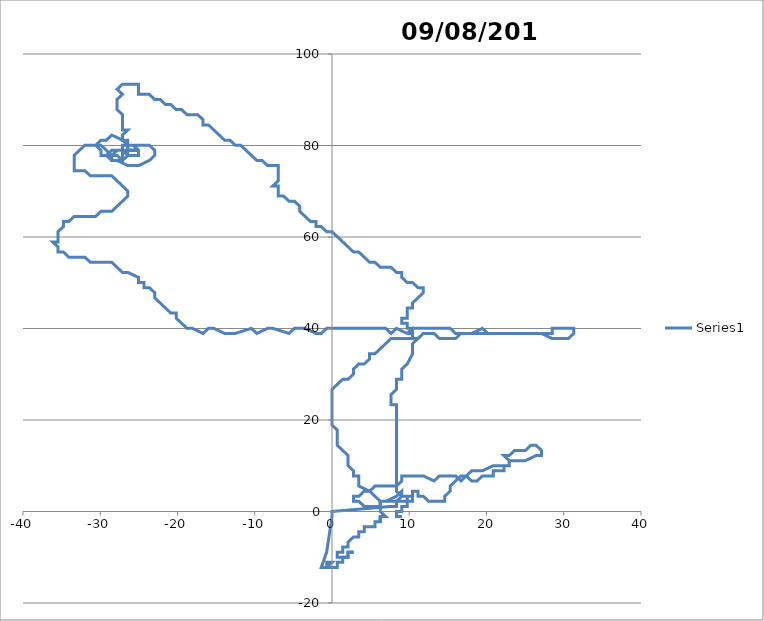
| Category | Series 0 |
|---|---|
| 6.95430298116107 | 2.224 |
| 8.34516266879644 | 3.336 |
| 9.04059190688401 | 4.448 |
| 9.04059289119677 | 3.336 |
| 8.34516357739261 | 2.224 |
| 8.34516357739261 | 2.224 |
| 8.34516448598856 | 1.112 |
| 8.34516448598856 | 1.112 |
| 8.34516448598856 | 1.112 |
| 8.34516448598856 | 1.112 |
| 8.34516448598856 | 1.112 |
| 8.34516448598856 | 1.112 |
| 8.34516448598856 | 1.112 |
| 8.34516448598856 | 1.112 |
| 8.34516448598856 | 1.112 |
| 7.64973411215744 | 1.112 |
| 7.64973411215744 | 1.112 |
| 7.64973411215744 | 1.112 |
| 0.0 | 0 |
| 0.0 | 0 |
| 0.0 | 0 |
| 0.0 | 0 |
| 0.0 | 0 |
| 0.0 | 0 |
| 0.0 | 0 |
| 0.0 | 0 |
| 0.0 | 0 |
| 0.0 | 0 |
| 0.0 | 0 |
| 0.0 | 0 |
| 0.0 | 0 |
| 0.0 | 0 |
| 0.0 | 0 |
| 0.0 | 0 |
| 0.0 | 0 |
| 0.0 | 0 |
| 0.0 | 0 |
| 0.0 | 0 |
| 0.0 | -1.112 |
| 0.0 | -1.112 |
| 0.0 | -1.112 |
| -0.695430903846846 | -8.896 |
| -1.39086226199048 | -12.231 |
| -1.39086226199048 | -12.231 |
| -1.39086226199048 | -12.231 |
| -1.39086226199048 | -12.231 |
| -0.695431130995243 | -12.231 |
| -0.69543105527913 | -11.119 |
| -0.69543105527913 | -11.119 |
| -0.69543105527913 | -11.119 |
| -0.69543105527913 | -11.119 |
| 0.0 | -11.119 |
| 0.0 | -11.119 |
| 0.0 | -11.119 |
| 0.0 | -11.119 |
| 0.0 | -11.119 |
| -0.695431130995243 | -12.231 |
| -0.695431130995243 | -12.231 |
| 0.0 | -12.231 |
| 0.0 | -12.231 |
| 0.0 | -12.231 |
| 0.0 | -12.231 |
| 0.0 | -12.231 |
| 0.0 | -12.231 |
| 0.0 | -12.231 |
| 0.695431130993313 | -12.231 |
| 0.695431130993313 | -12.231 |
| 0.695431130993313 | -12.231 |
| 0.6954310552772 | -11.119 |
| 1.39086211055633 | -11.119 |
| 1.39086211055633 | -11.119 |
| 1.39086211055633 | -11.119 |
| 1.39086211055633 | -11.119 |
| 1.39086211055633 | -11.119 |
| 1.39086195912406 | -10.008 |
| 2.08629293868512 | -10.008 |
| 2.08629293868512 | -10.008 |
| 2.08629293868512 | -10.008 |
| 2.08629293868512 | -10.008 |
| 2.08629293868512 | -10.008 |
| 2.08629271153667 | -8.896 |
| 2.08629271153667 | -8.896 |
| 2.08629271153667 | -8.896 |
| 2.08629271153667 | -8.896 |
| 2.78172361538349 | -8.896 |
| 2.78172361538349 | -8.896 |
| 2.78172361538349 | -8.896 |
| 2.78172361538349 | -8.896 |
| 2.78172361538349 | -8.896 |
| 2.78172361538349 | -8.896 |
| 2.78172361538349 | -8.896 |
| 2.78172361538349 | -8.896 |
| 2.78172361538349 | -8.896 |
| 2.78172361538349 | -8.896 |
| 2.78172361538349 | -8.896 |
| 2.08629271153667 | -8.896 |
| 2.08629271153667 | -8.896 |
| 2.08629271153667 | -8.896 |
| 2.08629271153667 | -8.896 |
| 2.08629271153667 | -8.896 |
| 2.08629293868512 | -10.008 |
| 1.39086195912406 | -10.008 |
| 1.39086195912406 | -10.008 |
| 1.39086195912406 | -10.008 |
| 1.39086195912406 | -10.008 |
| 1.39086195912406 | -10.008 |
| 1.39086195912406 | -10.008 |
| 1.39086195912406 | -10.008 |
| 0.695430979561067 | -10.008 |
| 0.695430979561067 | -10.008 |
| 0.695430979561067 | -10.008 |
| 0.695430979561067 | -10.008 |
| 0.695430979561067 | -10.008 |
| 0.695430979561067 | -10.008 |
| 0.695430979561067 | -10.008 |
| 0.695430979561067 | -10.008 |
| 0.695430979561067 | -10.008 |
| 0.695430979561067 | -10.008 |
| 0.695430979561067 | -10.008 |
| 0.695430903844916 | -8.896 |
| 0.695430903844916 | -8.896 |
| 0.695430903844916 | -8.896 |
| 0.695430903844916 | -8.896 |
| 0.695430903844916 | -8.896 |
| 0.695430903844916 | -8.896 |
| 0.695430903844916 | -8.896 |
| 0.695430903844916 | -8.896 |
| 0.695430903844916 | -8.896 |
| 0.695430903844916 | -8.896 |
| 0.695430903844916 | -8.896 |
| 0.695430903844916 | -8.896 |
| 0.695430903844916 | -8.896 |
| 0.695430903844916 | -8.896 |
| 1.39086180769176 | -8.896 |
| 1.39086180769176 | -8.896 |
| 1.39086180769176 | -8.896 |
| 1.39086180769176 | -8.896 |
| 1.39086165625942 | -7.784 |
| 1.39086165625942 | -7.784 |
| 1.39086165625942 | -7.784 |
| 2.08629248438816 | -7.784 |
| 2.08629248438816 | -7.784 |
| 2.08629248438816 | -7.784 |
| 2.08629225723959 | -6.672 |
| 2.08629225723959 | -6.672 |
| 2.08629225723959 | -6.672 |
| 2.08629225723959 | -6.672 |
| 2.08629225723959 | -6.672 |
| 2.78172270678923 | -5.56 |
| 3.47715338348748 | -5.56 |
| 3.47715338348748 | -5.56 |
| 3.47715338348748 | -5.56 |
| 3.47715338348748 | -5.56 |
| 3.47715338348748 | -5.56 |
| 3.47715300490634 | -4.448 |
| 3.47715300490634 | -4.448 |
| 3.47715300490634 | -4.448 |
| 4.17258360588642 | -4.448 |
| 4.17258360588642 | -4.448 |
| 4.17258360588642 | -4.448 |
| 4.17258360588642 | -4.448 |
| 4.17258360588642 | -4.448 |
| 4.17258360588642 | -4.448 |
| 4.17258360588642 | -4.448 |
| 4.17258360588642 | -4.448 |
| 4.17258315158895 | -3.336 |
| 4.86801367685469 | -3.336 |
| 4.86801367685469 | -3.336 |
| 4.86801367685469 | -3.336 |
| 4.86801367685469 | -3.336 |
| 4.86801367685469 | -3.336 |
| 4.86801367685469 | -3.336 |
| 4.86801367685469 | -3.336 |
| 4.86801367685469 | -3.336 |
| 4.86801367685469 | -3.336 |
| 5.5634442021204 | -3.336 |
| 5.5634442021204 | -3.336 |
| 5.5634442021204 | -3.336 |
| 5.5634442021204 | -3.336 |
| 5.56344359639029 | -2.224 |
| 5.56344359639029 | -2.224 |
| 5.56344359639029 | -2.224 |
| 5.56344359639029 | -2.224 |
| 5.56344359639029 | -2.224 |
| 5.56344359639029 | -2.224 |
| 5.56344359639029 | -2.224 |
| 6.25887404593779 | -2.224 |
| 6.25887404593779 | -2.224 |
| 6.25887404593779 | -2.224 |
| 6.25887404593779 | -2.224 |
| 6.25887404593779 | -2.224 |
| 6.25887336449124 | -1.112 |
| 6.25887336449124 | -1.112 |
| 6.25887404593779 | -2.224 |
| 6.25887404593779 | -2.224 |
| 6.25887404593779 | -2.224 |
| 6.25887404593779 | -2.224 |
| 6.25887404593779 | -2.224 |
| 6.25887404593779 | -2.224 |
| 6.25887404593779 | -2.224 |
| 6.25887404593779 | -2.224 |
| 6.25887404593779 | -2.224 |
| 6.25887404593779 | -2.224 |
| 6.25887404593779 | -2.224 |
| 6.25887404593779 | -2.224 |
| 6.25887404593779 | -2.224 |
| 6.25887404593779 | -2.224 |
| 6.25887404593779 | -2.224 |
| 6.25887404593779 | -2.224 |
| 6.25887404593779 | -2.224 |
| 6.25887404593779 | -2.224 |
| 6.25887404593779 | -2.224 |
| 6.25887404593779 | -2.224 |
| 6.25887404593779 | -2.224 |
| 6.25887404593779 | -2.224 |
| 6.25887404593779 | -2.224 |
| 6.25887404593779 | -2.224 |
| 6.25887404593779 | -2.224 |
| 6.25887404593779 | -2.224 |
| 6.25887404593779 | -2.224 |
| 6.25887404593779 | -2.224 |
| 6.25887404593779 | -2.224 |
| 6.25887336449124 | -1.112 |
| 6.25887336449124 | -1.112 |
| 6.25887336449124 | -1.112 |
| 6.95430373832436 | -1.112 |
| 6.95430373832436 | -1.112 |
| 6.95430373832436 | -1.112 |
| 6.95430373832436 | -1.112 |
| 6.95430373832436 | -1.112 |
| 6.95430373832436 | -1.112 |
| 6.95430373832436 | -1.112 |
| 6.95430373832436 | -1.112 |
| 6.25887268304453 | 0 |
| 6.25887268304453 | 0 |
| 6.25887200159764 | 1.112 |
| 6.25887200159764 | 1.112 |
| 6.25887132015059 | 2.224 |
| 5.56344056773747 | 3.336 |
| 4.86800996675497 | 4.448 |
| 4.86800996675497 | 4.448 |
| 3.47714959767191 | 5.56 |
| 3.47714921908984 | 6.672 |
| 3.47714884050767 | 7.784 |
| 2.78171907240538 | 7.784 |
| 2.78171876953957 | 8.896 |
| 2.08628885000431 | 10.008 |
| 2.08628862285484 | 11.119 |
| 2.08628839570532 | 12.231 |
| 2.08628839570532 | 12.231 |
| 1.3908587790378 | 13.343 |
| 0.695429313801392 | 14.455 |
| 0.695429238084826 | 15.567 |
| 0.695429238084826 | 15.567 |
| 0.695429162368242 | 16.679 |
| 0.695429086651639 | 17.791 |
| 0.0 | 18.903 |
| 0.0 | 18.903 |
| 0.0 | 21.127 |
| 0.0 | 22.239 |
| 0.0 | 23.351 |
| 0.0 | 23.351 |
| 0.0 | 24.463 |
| 0.0 | 25.575 |
| 0.0 | 26.687 |
| 0.695428405201362 | 27.799 |
| 0.695428405201362 | 27.799 |
| 1.39085665897107 | 28.911 |
| 2.08628498845563 | 28.911 |
| 2.78171301507487 | 30.023 |
| 2.78171271220755 | 31.135 |
| 3.47714051167614 | 32.247 |
| 4.17256861401018 | 32.247 |
| 4.86799618632805 | 33.358 |
| 4.86799565630985 | 34.47 |
| 5.56342360721202 | 34.47 |
| 6.2588508766601 | 35.582 |
| 6.95427799467607 | 36.694 |
| 7.64970496125796 | 37.806 |
| 8.34513268500731 | 37.806 |
| 9.04056040875855 | 37.806 |
| 9.04056040875855 | 37.806 |
| 10.431415856259 | 37.806 |
| 11.1268435800101 | 37.806 |
| 11.8222700165709 | 38.918 |
| 13.2131253126389 | 38.918 |
| 13.9085544750101 | 37.806 |
| 14.6039821987609 | 37.806 |
| 15.9948376462604 | 37.806 |
| 16.6902635528039 | 38.918 |
| 17.3856912008375 | 38.918 |
| 18.081118848869 | 38.918 |
| 19.4719741449338 | 38.918 |
| 20.167401792967 | 38.918 |
| 20.8628294410002 | 38.918 |
| 21.5582570890313 | 38.918 |
| 22.949112385097 | 38.918 |
| 23.6445400331278 | 38.918 |
| 25.0353953291929 | 38.918 |
| 25.7308229772234 | 38.918 |
| 27.1216782732878 | 38.918 |
| 28.5125366737451 | 37.806 |
| 29.2079643974919 | 37.806 |
| 29.9033921212405 | 37.806 |
| 30.5988198449889 | 37.806 |
| 31.2942441614721 | 38.918 |
| 31.2942441614721 | 38.918 |
| 31.2942441614721 | 38.918 |
| 31.294240754208 | 40.03 |
| 30.5988131818955 | 40.03 |
| 29.903385609581 | 40.03 |
| 29.903385609581 | 40.03 |
| 29.2079580372664 | 40.03 |
| 28.5125304649536 | 40.03 |
| 28.5125304649536 | 40.03 |
| 28.5125335693497 | 38.918 |
| 27.8171059213179 | 38.918 |
| 26.4262506252556 | 38.918 |
| 25.7308229772234 | 38.918 |
| 25.0353953291929 | 38.918 |
| 24.3399676811604 | 38.918 |
| 23.6445400331278 | 38.918 |
| 22.2536847370642 | 38.918 |
| 21.5582570890313 | 38.918 |
| 20.167401792967 | 38.918 |
| 19.4719720248584 | 40.03 |
| 18.081118848869 | 38.918 |
| 17.3856912008375 | 38.918 |
| 15.9948359047703 | 38.918 |
| 15.2994065909649 | 40.03 |
| 13.9085514463313 | 40.03 |
| 13.2131238740163 | 40.03 |
| 12.5176963016993 | 40.03 |
| 11.8222687293822 | 40.03 |
| 11.126841157067 | 40.03 |
| 10.4314135847499 | 40.03 |
| 9.73598707247229 | 38.918 |
| 8.34513086780002 | 40.03 |
| 7.64970412837139 | 38.918 |
| 6.95427572316724 | 40.03 |
| 6.25884815084984 | 40.03 |
| 4.86799300621688 | 40.03 |
| 4.17256543389939 | 40.03 |
| 2.78171028926631 | 40.03 |
| 2.08628271694878 | 40.03 |
| 1.39085514463317 | 40.03 |
| 0.695427572315619 | 40.03 |
| 0.0 | 40.03 |
| -0.695427572317549 | 40.03 |
| -0.695427572317549 | 40.03 |
| -1.39085529606906 | 38.918 |
| -2.08628294410165 | 38.918 |
| -3.47713786158575 | 40.03 |
| -4.86799300621881 | 40.03 |
| -5.5634211842721 | 38.918 |
| -7.64970329548461 | 40.03 |
| -8.34513086780195 | 40.03 |
| -9.73598707247229 | 38.918 |
| -10.4314135847518 | 40.03 |
| -10.4314135847518 | 40.03 |
| -12.5176976646068 | 38.918 |
| -12.5176976646068 | 38.918 |
| -13.9085529606728 | 38.918 |
| -15.2994065909669 | 40.03 |
| -15.9948341632817 | 40.03 |
| -16.6902635528058 | 38.918 |
| -18.0811168802295 | 40.03 |
| -18.7765444525459 | 40.03 |
| -19.4719699047843 | 41.142 |
| -20.1673952055901 | 42.254 |
| -20.167393009796 | 43.366 |
| -20.8628203549611 | 43.366 |
| -21.5582453528955 | 44.478 |
| -22.2536701993969 | 45.59 |
| -22.9490948944635 | 46.702 |
| -22.9490948944635 | 46.702 |
| -22.9490923957988 | 47.814 |
| -23.6445168637108 | 48.926 |
| -24.3399438302899 | 48.926 |
| -24.3399411801897 | 50.038 |
| -25.0353680710496 | 50.038 |
| -25.0353653452316 | 51.15 |
| -26.4262160982675 | 52.262 |
| -27.1216428376927 | 52.262 |
| -27.8170665484315 | 53.374 |
| -28.5124901077349 | 54.486 |
| -29.2079166957253 | 54.486 |
| -30.5987698717095 | 54.486 |
| -31.2941964596995 | 54.486 |
| -31.9896195646981 | 55.597 |
| -32.6850460769724 | 55.597 |
| -33.3804725892447 | 55.597 |
| -34.0758991015188 | 55.597 |
| -34.7713218279276 | 56.709 |
| -35.4667482644841 | 56.709 |
| -35.4667444029028 | 57.821 |
| -36.1621668264422 | 58.933 |
| -35.4667405413205 | 58.933 |
| -35.4667366797372 | 60.045 |
| -35.466732818153 | 61.157 |
| -34.7713028985979 | 62.269 |
| -34.7712991127291 | 63.381 |
| -34.0758731304784 | 63.381 |
| -33.3804435137906 | 64.493 |
| -31.9895917007212 | 64.493 |
| -30.5987398876512 | 64.493 |
| -29.9033107252663 | 65.605 |
| -29.2078848944474 | 65.605 |
| -28.5124590636303 | 65.605 |
| -27.8170302041138 | 66.717 |
| -27.1216014960314 | 67.829 |
| -26.4261729393849 | 68.941 |
| -26.4261729393849 | 68.941 |
| -26.4261700621204 | 70.053 |
| -27.1215926370852 | 71.165 |
| -27.8170150606162 | 72.277 |
| -27.8170150606162 | 72.277 |
| -28.5124373327111 | 73.389 |
| -29.9032879343023 | 73.389 |
| -30.5987132350986 | 73.389 |
| -31.2941385358929 | 73.389 |
| -31.989560353681 | 74.501 |
| -33.3804108038356 | 74.501 |
| -33.3804071693916 | 75.613 |
| -33.3804035349468 | 76.724 |
| -33.3804035349468 | 76.724 |
| -33.380399900501 | 77.836 |
| -33.380399900501 | 77.836 |
| -32.6849713438485 | 78.948 |
| -31.9895429386283 | 80.06 |
| -30.5986932456493 | 80.06 |
| -30.5986932456493 | 80.06 |
| -29.9032683991587 | 80.06 |
| -29.2078467328095 | 78.948 |
| -28.512424915026 | 77.836 |
| -28.5124280194484 | 76.724 |
| -27.8170029458044 | 76.724 |
| -26.4261556757868 | 75.613 |
| -25.7307305264249 | 75.613 |
| -25.0353053770628 | 75.613 |
| -23.6444525039417 | 76.724 |
| -22.9490249316173 | 77.836 |
| -22.9490249316173 | 77.836 |
| -22.9490224329352 | 78.948 |
| -23.6444447807425 | 80.06 |
| -24.3398696272343 | 80.06 |
| -25.0352944737241 | 80.06 |
| -26.4261441667071 | 80.06 |
| -27.1215690131965 | 80.06 |
| -27.1215719661852 | 78.948 |
| -27.8169968883941 | 78.948 |
| -28.512424915026 | 77.836 |
| -29.2078499129503 | 77.836 |
| -29.9032749108764 | 77.836 |
| -29.903271655018 | 78.948 |
| -29.903271655018 | 78.948 |
| -30.5986932456493 | 80.06 |
| -29.9032651432986 | 81.172 |
| -29.2078403725254 | 81.172 |
| -28.5124124973285 | 82.284 |
| -27.1215660602071 | 81.172 |
| -27.1215660602071 | 81.172 |
| -26.4261441667071 | 80.06 |
| -26.4261470439781 | 78.948 |
| -27.1215719661852 | 78.948 |
| -27.8169968883941 | 78.948 |
| -28.512424915026 | 77.836 |
| -27.8169999170996 | 77.836 |
| -27.8169999170996 | 77.836 |
| -27.1215778721603 | 76.724 |
| -26.4261499212484 | 77.836 |
| -27.1215719661852 | 78.948 |
| -27.1215719661852 | 78.948 |
| -27.8169968883941 | 78.948 |
| -28.5124218106028 | 78.948 |
| -29.2078499129503 | 77.836 |
| -28.5124280194484 | 76.724 |
| -27.8170029458044 | 76.724 |
| -27.1215778721603 | 76.724 |
| -27.1215749191731 | 77.836 |
| -27.1215719661852 | 78.948 |
| -26.4261470439781 | 78.948 |
| -26.4261441667071 | 80.06 |
| -25.7307193202157 | 80.06 |
| -25.0352971995598 | 78.948 |
| -25.0352999253948 | 77.836 |
| -25.7307249233216 | 77.836 |
| -26.4261499212484 | 77.836 |
| -26.4261499212484 | 77.836 |
| -26.4261470439781 | 78.948 |
| -26.4261470439781 | 78.948 |
| -25.730722121769 | 78.948 |
| -25.0352971995598 | 78.948 |
| -25.0352971995598 | 78.948 |
| -25.0352971995598 | 78.948 |
| -26.4261470439781 | 78.948 |
| -26.4261470439781 | 78.948 |
| -26.4261441667071 | 80.06 |
| -26.4261412894354 | 81.172 |
| -27.1215660602071 | 81.172 |
| -27.121563107217 | 82.284 |
| -27.121563107217 | 82.284 |
| -26.4261355348898 | 83.396 |
| -27.1215601542261 | 83.396 |
| -27.1215572012345 | 84.508 |
| -27.1215572012345 | 84.508 |
| -27.1215542482422 | 85.62 |
| -27.1215512952491 | 86.732 |
| -27.1215512952491 | 86.732 |
| -27.8169726587224 | 87.844 |
| -27.8169696300101 | 88.956 |
| -27.8169696300101 | 88.956 |
| -27.816966601297 | 90.068 |
| -27.1215394832695 | 91.18 |
| -27.1215394832695 | 91.18 |
| -27.8169605438685 | 92.292 |
| -27.8169605438685 | 92.292 |
| -27.1215335772753 | 93.404 |
| -26.4261096393992 | 93.404 |
| -25.7306857015211 | 93.404 |
| -25.7306857015211 | 93.404 |
| -25.0352617636429 | 93.404 |
| -25.0352644894868 | 92.292 |
| -25.0352644894868 | 92.292 |
| -25.0352644894868 | 92.292 |
| -25.0352672153299 | 91.18 |
| -24.3398431260177 | 91.18 |
| -24.3398431260177 | 91.18 |
| -23.6444190367036 | 91.18 |
| -23.6444190367036 | 91.18 |
| -22.9489974460801 | 90.068 |
| -22.2535732810479 | 90.068 |
| -21.5581514632681 | 88.956 |
| -20.8627272225198 | 88.956 |
| -20.1673051775859 | 87.844 |
| -19.4718808611176 | 87.844 |
| -18.7764585890315 | 86.732 |
| -18.0810341968452 | 86.732 |
| -17.3856098046589 | 86.732 |
| -16.6901872297009 | 85.62 |
| -16.6901890469269 | 84.508 |
| -15.9947645033049 | 84.508 |
| -15.2993416254749 | 83.396 |
| -14.603918596207 | 82.284 |
| -14.603918596207 | 82.284 |
| -13.9084954155032 | 81.172 |
| -13.2130706447297 | 81.172 |
| -12.5176472368724 | 80.06 |
| -11.8222223903792 | 80.06 |
| -11.1267987553703 | 78.948 |
| -11.1267987553703 | 78.948 |
| -10.4313749689239 | 77.836 |
| -9.73595103104192 | 76.724 |
| -9.0405259573975 | 76.724 |
| -8.34510179236232 | 75.613 |
| -8.34510179236232 | 75.613 |
| -7.64967664299829 | 75.613 |
| -6.95425149363615 | 75.613 |
| -6.95425225081198 | 74.501 |
| -6.95425300798761 | 73.389 |
| -6.95425300798761 | 73.389 |
| -6.95425376516306 | 72.277 |
| -6.95425376516306 | 72.277 |
| -6.95425376516306 | 72.277 |
| -7.64967997457068 | 71.165 |
| -6.95425452233833 | 71.165 |
| -6.95425452233833 | 71.165 |
| -6.95425452233833 | 71.165 |
| -6.9542552795134 | 70.053 |
| -6.95425603668828 | 68.941 |
| -6.95425603668828 | 68.941 |
| -6.95425603668828 | 68.941 |
| -6.25883043301897 | 68.941 |
| -6.25883043301897 | 68.941 |
| -6.25883043301897 | 68.941 |
| -6.25883043301897 | 68.941 |
| -5.56340543509131 | 67.829 |
| -5.56340543509131 | 67.829 |
| -4.86797975570447 | 67.829 |
| -4.86797975570447 | 67.829 |
| -4.17255453062231 | 66.717 |
| -4.17255453062231 | 66.717 |
| -4.17255498492691 | 65.605 |
| -3.47712953269414 | 64.493 |
| -2.78170392902452 | 63.381 |
| -2.08627794676792 | 63.381 |
| -2.08627817392004 | 62.269 |
| -1.39085211594799 | 62.269 |
| -0.695426133691353 | 61.157 |
| 0.0 | 61.157 |
| 0.69542620940676 | 60.045 |
| 1.39085257025009 | 58.933 |
| 1.39085257025009 | 58.933 |
| 2.08627908252606 | 57.821 |
| 2.78170574623847 | 56.709 |
| 3.47713218279903 | 56.709 |
| 4.17255907366121 | 55.597 |
| 4.86798611595971 | 54.486 |
| 5.56341270395471 | 54.486 |
| 6.25883997340279 | 53.374 |
| 7.6496933008271 | 53.374 |
| 8.34512087314375 | 52.262 |
| 9.04054761257303 | 52.262 |
| 9.04054859689646 | 51.15 |
| 9.73597647208324 | 50.038 |
| 10.4314033629449 | 50.038 |
| 11.1268314652827 | 48.926 |
| 11.8222584318614 | 48.926 |
| 11.8222597190526 | 47.814 |
| 11.8222597190526 | 47.814 |
| 11.1268338882306 | 46.702 |
| 11.1268338882306 | 46.702 |
| 10.4314079059721 | 45.59 |
| 10.4314079059721 | 45.59 |
| 10.4314090417282 | 44.478 |
| 9.73598177228106 | 44.478 |
| 9.73598283231983 | 43.366 |
| 9.73598389235835 | 42.254 |
| 9.0405564714751 | 42.254 |
| 9.04055745579633 | 41.142 |
| 9.04055745579633 | 41.142 |
| 9.73598495239659 | 41.142 |
| 9.73598495239659 | 41.142 |
| 9.73598495239659 | 41.142 |
| 9.73598495239659 | 41.142 |
| 9.73598601243457 | 40.03 |
| 10.4314135847499 | 40.03 |
| 10.4314135847499 | 40.03 |
| 10.4314135847499 | 40.03 |
| 10.4314147205046 | 38.918 |
| 9.73598707247229 | 38.918 |
| 10.4314147205046 | 38.918 |
| 10.4314147205046 | 38.918 |
| 10.4314147205046 | 38.918 |
| 10.431415856259 | 37.806 |
| 10.431415856259 | 37.806 |
| 11.1268435800101 | 37.806 |
| 10.4314169920131 | 36.694 |
| 10.4314169920131 | 36.694 |
| 10.431418127767 | 35.582 |
| 10.431418127767 | 35.582 |
| 10.4314192635205 | 34.47 |
| 10.4314192635205 | 34.47 |
| 9.73599343269307 | 32.247 |
| 9.73599343269307 | 32.247 |
| 9.04056631467637 | 31.135 |
| 9.04056631467637 | 31.135 |
| 9.04056828331369 | 28.911 |
| 8.34513995382744 | 28.911 |
| 8.34514086242893 | 27.799 |
| 8.34514177103021 | 26.687 |
| 7.64971412299658 | 25.575 |
| 7.64971495588066 | 24.463 |
| 7.64971578876454 | 23.351 |
| 8.34514449683267 | 23.351 |
| 8.34514540543304 | 22.239 |
| 8.34514631403318 | 21.127 |
| 8.3451472226331 | 20.015 |
| 8.34514813123279 | 18.903 |
| 8.34514903983225 | 17.791 |
| 8.34514994843149 | 16.679 |
| 8.3451508570305 | 15.567 |
| 8.34515176562929 | 14.455 |
| 8.34515267422785 | 13.343 |
| 8.34515358282618 | 12.231 |
| 8.34515449142429 | 11.119 |
| 8.34515540002217 | 10.008 |
| 8.34515630861983 | 8.896 |
| 8.34515721721726 | 7.784 |
| 8.34515721721726 | 7.784 |
| 8.34515812581446 | 6.672 |
| 8.34515903441144 | 5.56 |
| 8.34515994300819 | 4.448 |
| 8.34515994300819 | 4.448 |
| 9.04059092257241 | 3.336 |
| 9.04059092257241 | 3.336 |
| 9.73602099354006 | 3.336 |
| 10.4314510645057 | 3.336 |
| 10.4314499287601 | 4.448 |
| 10.4314499287601 | 4.448 |
| 11.1268799240112 | 4.448 |
| 11.1268811354733 | 3.336 |
| 11.8223112064389 | 3.336 |
| 11.8223112064389 | 3.336 |
| 11.8223112064389 | 3.336 |
| 12.5177426403008 | 2.224 |
| 12.5177426403008 | 2.224 |
| 13.2131727869845 | 2.224 |
| 13.2131727869845 | 2.224 |
| 13.9086029336663 | 2.224 |
| 13.9086029336663 | 2.224 |
| 13.9086029336663 | 2.224 |
| 14.6040330803499 | 2.224 |
| 14.6040314903064 | 3.336 |
| 15.2994598955132 | 4.448 |
| 15.2994598955132 | 4.448 |
| 15.2994582297525 | 5.56 |
| 15.9948864078074 | 6.672 |
| 15.9948864078074 | 6.672 |
| 15.9948864078074 | 6.672 |
| 16.6903144344309 | 7.784 |
| 17.3857442025322 | 7.784 |
| 17.3857442025322 | 7.784 |
| 18.0811720020038 | 8.896 |
| 18.7766016943885 | 8.896 |
| 19.4720313867713 | 8.896 |
| 20.8628885000461 | 10.008 |
| 20.8628885000461 | 10.008 |
| 22.9491773500476 | 10.008 |
| 22.9491748514034 | 11.119 |
| 23.6446043923526 | 11.119 |
| 24.3400339333036 | 11.119 |
| 25.0354634742544 | 11.119 |
| 26.4263196789266 | 12.231 |
| 27.1217491441606 | 12.231 |
| 27.121746191216 | 13.343 |
| 27.121746191216 | 13.343 |
| 26.4263139244697 | 14.455 |
| 26.4263139244697 | 14.455 |
| 25.7308846106687 | 14.455 |
| 25.7308846106687 | 14.455 |
| 25.0354580226651 | 13.343 |
| 24.3400286331473 | 13.343 |
| 24.3400286331473 | 13.343 |
| 23.6445992436293 | 13.343 |
| 22.9491723527586 | 12.231 |
| 22.9491723527586 | 12.231 |
| 22.2537428875239 | 12.231 |
| 22.2537428875239 | 12.231 |
| 22.9491748514034 | 11.119 |
| 22.9491748514034 | 11.119 |
| 22.9491748514034 | 11.119 |
| 22.9491748514034 | 11.119 |
| 22.9491773500476 | 10.008 |
| 22.2537477333799 | 10.008 |
| 22.2537477333799 | 10.008 |
| 22.253750156307 | 8.896 |
| 22.253750156307 | 8.896 |
| 22.253750156307 | 8.896 |
| 21.5583204639227 | 8.896 |
| 21.5583204639227 | 8.896 |
| 20.8628907715403 | 8.896 |
| 20.8628930430339 | 7.784 |
| 20.1674632749329 | 7.784 |
| 20.1674632749329 | 7.784 |
| 19.4720335068319 | 7.784 |
| 18.7766057830765 | 6.672 |
| 18.0811759392588 | 6.672 |
| 17.3857442025322 | 7.784 |
| 16.6903162516253 | 6.672 |
| 15.9948846663294 | 7.784 |
| 14.6040251301283 | 7.784 |
| 13.9085953620267 | 7.784 |
| 13.2131670325391 | 6.672 |
| 11.8223060577233 | 7.784 |
| 11.1268762896233 | 7.784 |
| 10.4314465215214 | 7.784 |
| 9.73601675342135 | 7.784 |
| 9.04058698531932 | 7.784 |
| 9.04058796963296 | 6.672 |
| 8.34515903441144 | 5.56 |
| 7.64972911487841 | 5.56 |
| 7.64972911487841 | 5.56 |
| 5.56343935627528 | 5.56 |
| 5.56343935627528 | 5.56 |
| 4.86800996675497 | 4.448 |
| 4.17257997150348 | 4.448 |
| 3.47715035483578 | 3.336 |
| 2.78172028386787 | 3.336 |
| 2.7817205867333 | 2.224 |
| 3.47715073341757 | 2.224 |
| 4.17258133439793 | 1.112 |
| 4.8680115567985 | 1.112 |
| 4.8680115567985 | 1.112 |
| 5.56344177919905 | 1.112 |
| 5.56344177919905 | 1.112 |
| 6.25887200159764 | 1.112 |
| 6.25887132015059 | 2.224 |
| 9.04059190688506 | 2.224 |
| 9.04059190688506 | 2.224 |
| 9.04059190688506 | 2.224 |
| 9.73602205356907 | 2.224 |
| 9.73602099354006 | 3.336 |
| 10.4314510645057 | 3.336 |
| 10.4314510645057 | 3.336 |
| 10.4314510645057 | 3.336 |
| 10.4314510645057 | 3.336 |
| 10.4314510645057 | 3.336 |
| 10.4314522002511 | 2.224 |
| 10.4314522002511 | 2.224 |
| 10.4314522002511 | 2.224 |
| 9.73602205356907 | 2.224 |
| 9.73602205356907 | 2.224 |
| 9.73602205356907 | 2.224 |
| 9.73602205356907 | 2.224 |
| 9.73602205356907 | 2.224 |
| 9.73602205356907 | 2.224 |
| 9.73602205356907 | 2.224 |
| 9.73602205356907 | 2.224 |
| 9.73602311359782 | 1.112 |
| 9.73602311359782 | 1.112 |
| 9.73602311359782 | 1.112 |
| 9.04059289119748 | 1.112 |
| 9.04059289119748 | 1.112 |
| 9.04059289119748 | 1.112 |
| 9.04059289119748 | 1.112 |
| 9.04059289119748 | 1.112 |
| 9.04059289119748 | 1.112 |
| 9.04059289119748 | 1.112 |
| 9.04059289119748 | 1.112 |
| 9.04059289119748 | 1.112 |
| 9.04059387550964 | 0 |
| 9.04059387550964 | 0 |
| 9.04059387550964 | 0 |
| 8.34516357739294 | 0 |
| 8.34516357739294 | 0 |
| 8.34516357739294 | 0 |
| 8.34516357739294 | 0 |
| 8.34516357739294 | 0 |
| 8.34516448598856 | -1.112 |
| 8.34516448598856 | -1.112 |
| 8.34516448598856 | -1.112 |
| 8.34516448598856 | -1.112 |
| 8.34516448598856 | -1.112 |
| 9.04059485982157 | -1.112 |
| 8.34516448598856 | -1.112 |
| 8.34516448598856 | -1.112 |
| 8.34516448598856 | -1.112 |
| 8.34516448598856 | -1.112 |
| 8.34516448598856 | -1.112 |
| 8.34516448598856 | -1.112 |
| 8.34516448598856 | -1.112 |
| 8.34516448598856 | -1.112 |
| 8.34516448598856 | -1.112 |
| 8.34516448598856 | -1.112 |
| 8.34516448598856 | -1.112 |
| 8.34516448598856 | -1.112 |